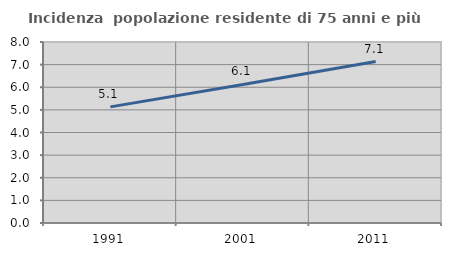
| Category | Incidenza  popolazione residente di 75 anni e più |
|---|---|
| 1991.0 | 5.132 |
| 2001.0 | 6.122 |
| 2011.0 | 7.134 |